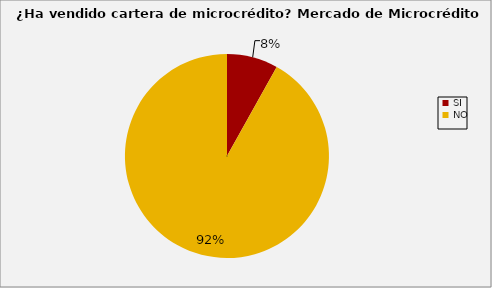
| Category | Series 0 |
|---|---|
| SI | 0.081 |
| NO | 0.919 |